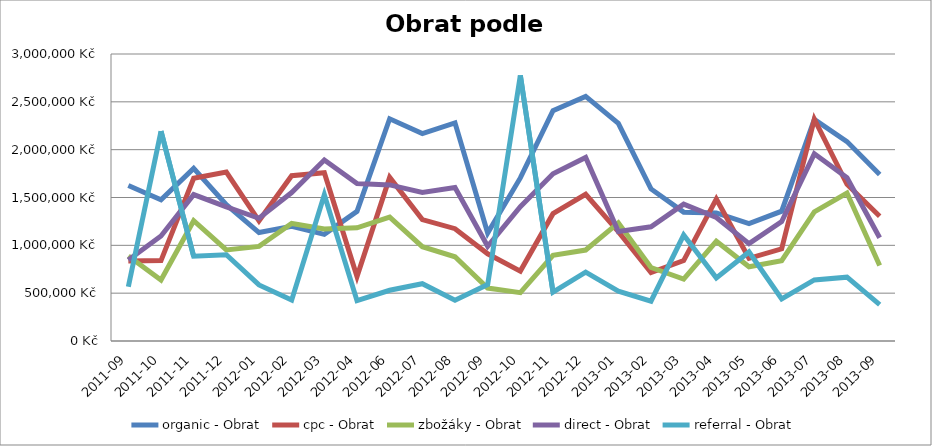
| Category | organic - Obrat | cpc - Obrat | zbožáky - Obrat | direct - Obrat | referral - Obrat |
|---|---|---|---|---|---|
| 2011-09 | 1625663.641 | 835188.604 | 888372.105 | 847458.259 | 566162.747 |
| 2011-10 | 1476812.207 | 840563.397 | 637314.178 | 1097963.686 | 2192852.522 |
| 2011-11 | 1803935.248 | 1700967.096 | 1257691.446 | 1530514.653 | 885749.523 |
| 2011-12 | 1425163.879 | 1766352.186 | 952360.74 | 1402372.099 | 901659.911 |
| 2012-01 | 1133553.059 | 1256377.843 | 989167.461 | 1282931.223 | 586295.278 |
| 2012-02 | 1199037.248 | 1727304.539 | 1228994.704 | 1551517.864 | 427360.018 |
| 2012-03 | 1115182.801 | 1759024.795 | 1171353.023 | 1892207.596 | 1529313.188 |
| 2012-04 | 1354646.533 | 673208.93 | 1182778.366 | 1646781.006 | 421456.22 |
| 2012-06 | 2322866.539 | 1710651.299 | 1295872.224 | 1631867.123 | 530240.846 |
| 2012-07 | 2168274.402 | 1269661.934 | 986126.044 | 1552038.766 | 598849.37 |
| 2012-08 | 2280523.125 | 1174054.464 | 880622.419 | 1605412.984 | 425919.301 |
| 2012-09 | 1128459.892 | 911382.907 | 553269.568 | 989773.303 | 589392.394 |
| 2012-10 | 1704582.248 | 730670.406 | 505123.717 | 1403955.187 | 2775659.575 |
| 2012-11 | 2407538.364 | 1331046.485 | 895701.9 | 1747658.619 | 511218.145 |
| 2012-12 | 2556754.395 | 1533198.447 | 950837.955 | 1917909.911 | 719754.44 |
| 2013-01 | 2275561.142 | 1143577.551 | 1235363.624 | 1143788.215 | 520195.389 |
| 2013-02 | 1589456.447 | 715114.557 | 768342.314 | 1193783.906 | 416525.557 |
| 2013-03 | 1346859.656 | 840721.896 | 646511.611 | 1430259.984 | 1107369.584 |
| 2013-04 | 1339163.757 | 1484790.824 | 1042691.32 | 1291373.265 | 659841.82 |
| 2013-05 | 1227276.441 | 864370.15 | 775564.973 | 1017360.161 | 930667.596 |
| 2013-06 | 1356767.01 | 963783.263 | 840056.811 | 1248265.321 | 440137.497 |
| 2013-07 | 2315645.902 | 2319694.271 | 1349593.547 | 1956408.935 | 638038.348 |
| 2013-08 | 2084450.006 | 1637535.885 | 1547191.43 | 1705849.337 | 667548.28 |
| 2013-09 | 1741411.326 | 1303238.613 | 789571.622 | 1079425.153 | 380685.352 |